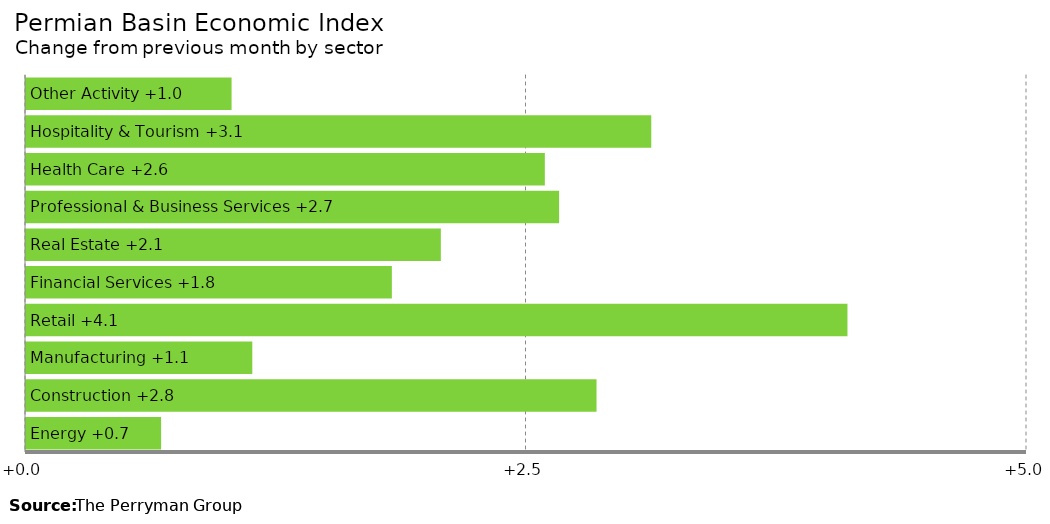
| Category | Change |
|---|---|
| Energy | 0.675 |
| Construction | 2.85 |
| Manufacturing | 1.13 |
| Retail | 4.103 |
| Financial Services | 1.827 |
| Real Estate | 2.072 |
| Professional & Business Services | 2.663 |
| Health Care | 2.592 |
| Hospitality & Tourism | 3.123 |
| Other Activity | 1.027 |